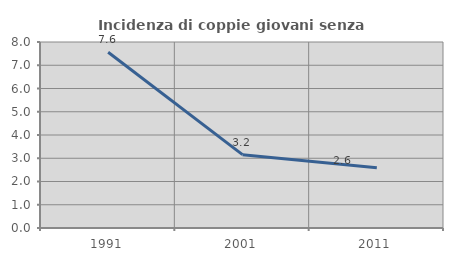
| Category | Incidenza di coppie giovani senza figli |
|---|---|
| 1991.0 | 7.558 |
| 2001.0 | 3.154 |
| 2011.0 | 2.593 |